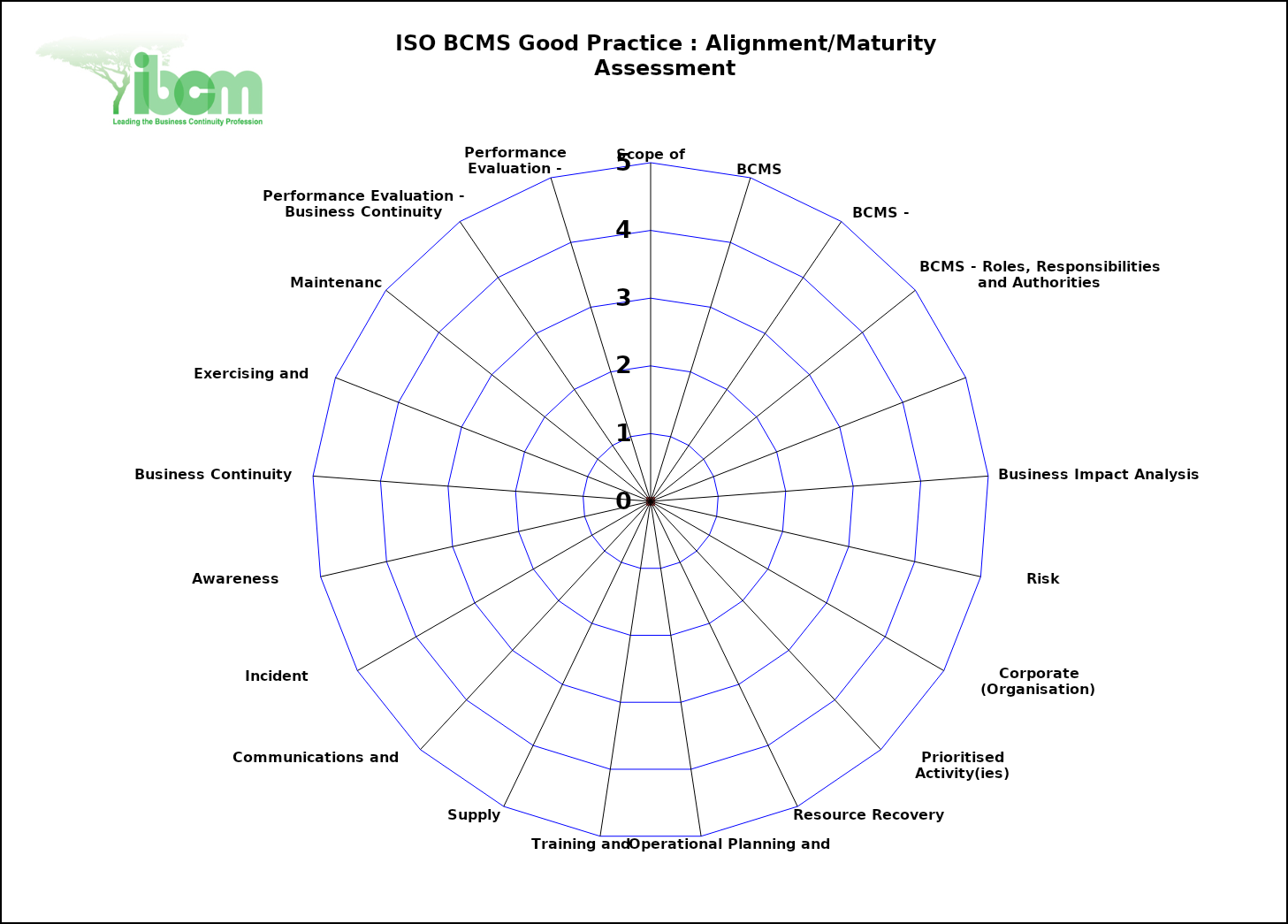
| Category | Series 0 | Series 1 |
|---|---|---|
| Scope of BCMS | 0 | 0 |
| BCMS | 0 | 0 |
| BCMS - Policy | 0 | 0 |
| BCMS - Roles, Responsibilities and Authorities | 0 | 0 |
|    Assurance | 0 | 0 |
| Business Impact Analysis (BIA) | 0 | 0 |
| Risk Assessment | 0 | 0 |
| Corporate (Organisation)
Strategy | 0 | 0 |
| Prioritised Activity(ies)
  Recovery Strategy | 0 | 0 |
|    Resource Recovery Strategy | 0 | 0 |
|   Operational Planning and Control | 0 | 0 |
| Training and Competence | 0 | 0 |
| Supply Chain | 0 | 0 |
| Communications and Warning | 0 | 0 |
| Incident Management | 0 | 0 |
| Awareness Programme | 0 | 0 |
| Business Continuity Plan(s) | 0 | 0 |
| Exercising and Testing | 0 | 0 |
| Maintenance | 0 | 0 |
| Performance Evaluation - Business Continuity Arrangements | 0 | 0 |
| Performance Evaluation - Management Review | 0 | 0 |